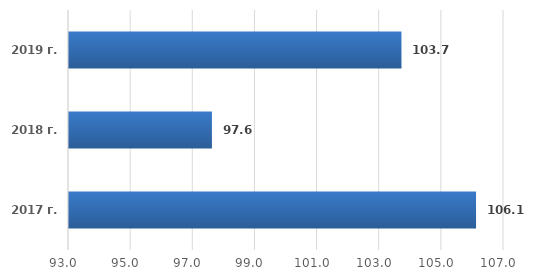
| Category | Series 0 |
|---|---|
| 2017 г. | 106.1 |
| 2018 г. | 97.6 |
| 2019 г. | 103.7 |